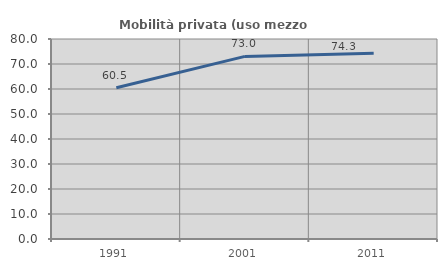
| Category | Mobilità privata (uso mezzo privato) |
|---|---|
| 1991.0 | 60.476 |
| 2001.0 | 73.037 |
| 2011.0 | 74.339 |